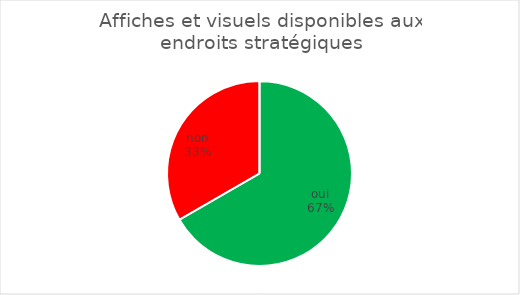
| Category | Affiches et visuels disponibles aux endroits stratégiques |
|---|---|
| oui | 8 |
| non | 4 |